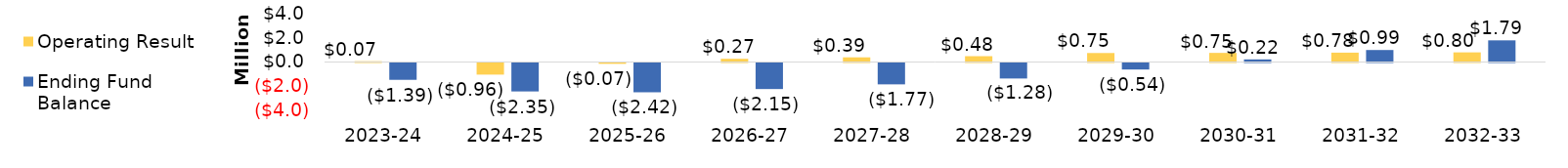
| Category | Operating Result | Ending Fund Balance |
|---|---|---|
| 2023-24 | 66455.258 | -1392285.742 |
| 2024-25 | -960998.55 | -2353284.292 |
| 2025-26 | -69446.464 | -2422730.756 |
| 2026-27 | 267794.206 | -2154936.55 |
| 2027-28 | 388193.616 | -1766742.934 |
| 2028-29 | 483675.932 | -1283067.002 |
| 2029-30 | 745249.881 | -537817.121 |
| 2030-31 | 754773.446 | 216956.325 |
| 2031-32 | 776002.423 | 992958.748 |
| 2032-33 | 799172.969 | 1792131.717 |